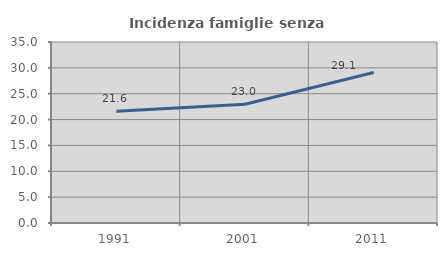
| Category | Incidenza famiglie senza nuclei |
|---|---|
| 1991.0 | 21.605 |
| 2001.0 | 22.977 |
| 2011.0 | 29.11 |